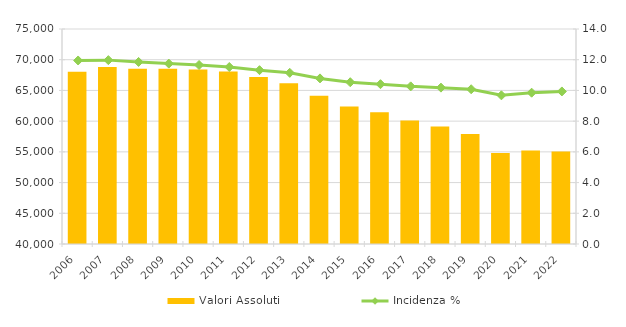
| Category | Valori Assoluti |
|---|---|
| 2006.0 | 68057 |
| 2007.0 | 68805 |
| 2008.0 | 68524 |
| 2009.0 | 68516 |
| 2010.0 | 68427 |
| 2011.0 | 68097 |
| 2012.0 | 67173 |
| 2013.0 | 66182 |
| 2014.0 | 64125 |
| 2015.0 | 62402 |
| 2016.0 | 61434 |
| 2017.0 | 60117 |
| 2018.0 | 59148 |
| 2019.0 | 57922 |
| 2020.0 | 54797 |
| 2021.0 | 55206 |
| 2022.0 | 55047 |